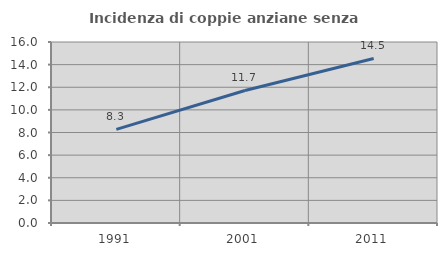
| Category | Incidenza di coppie anziane senza figli  |
|---|---|
| 1991.0 | 8.281 |
| 2001.0 | 11.716 |
| 2011.0 | 14.547 |